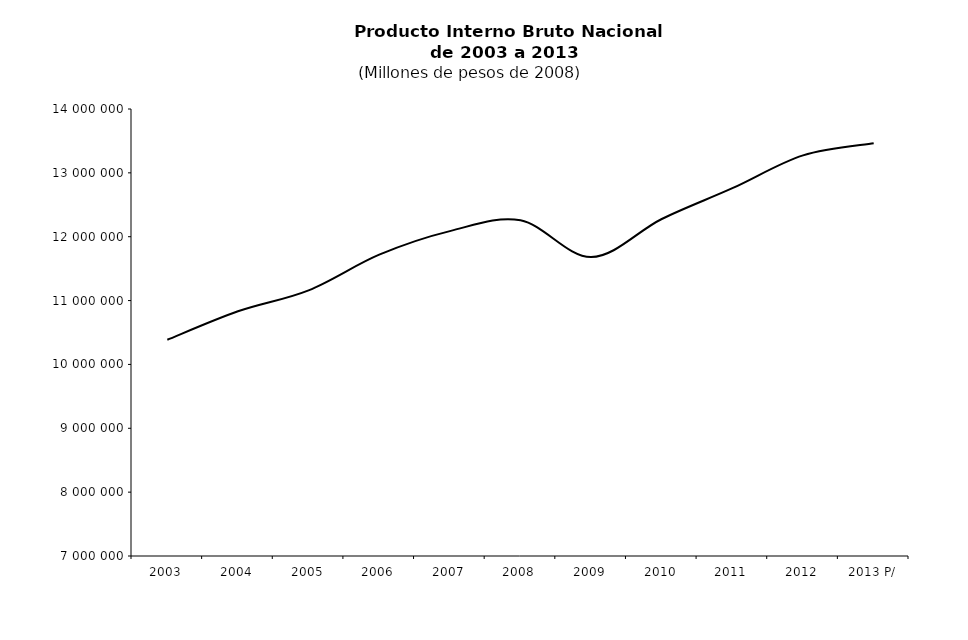
| Category | Producto Interno Bruto a precios de mercado  |
|---|---|
| 2003 | 10385857.077 |
| 2004 | 10832003.968 |
| 2005 | 11160492.604 |
| 2006 | 11718671.74 |
| 2007 | 12087601.944 |
| 2008 | 12256863.468 |
| 2009 | 11680749.352 |
| 2010 | 12277658.828 |
| 2011 | 12759532.2 |
| 2012 | 13273664.442 |
| 2013 P/ | 13464296.392 |